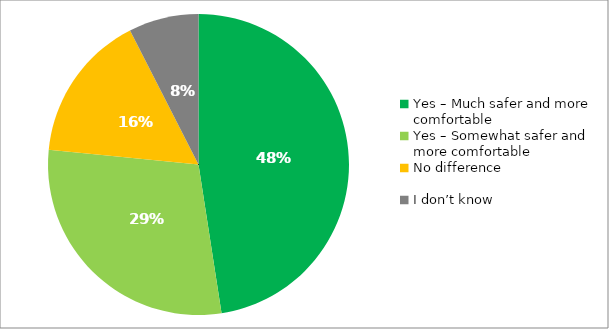
| Category | Responses |
|---|---|
| Yes – Much safer and more comfortable | 0.476 |
| Yes – Somewhat safer and more comfortable | 0.29 |
| No difference | 0.159 |
| I don’t know | 0.075 |